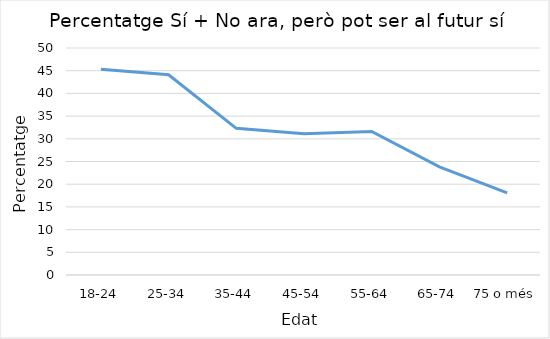
| Category | Series 0 |
|---|---|
| 18-24 | 45.3 |
| 25-34 | 44.1 |
| 35-44 | 32.3 |
| 45-54 | 31.1 |
| 55-64 | 31.6 |
| 65-74 | 23.8 |
| 75 o més | 18.1 |